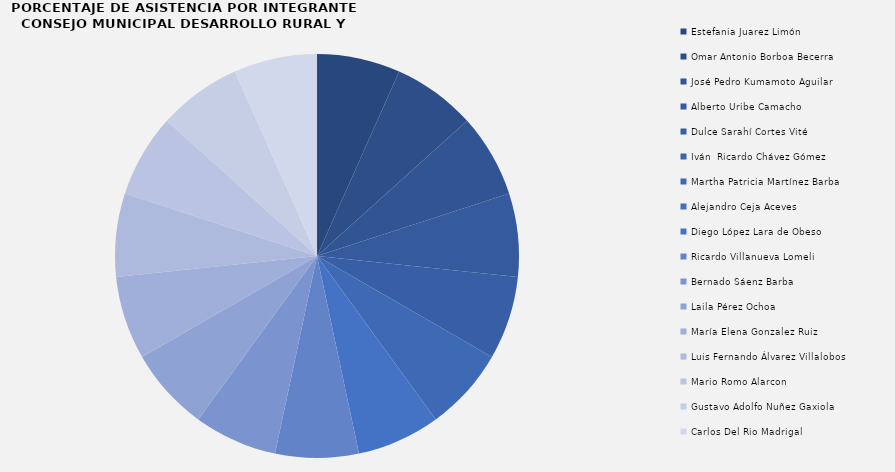
| Category | Series 0 |
|---|---|
| Estefania Juarez Limón | 1 |
| Omar Antonio Borboa Becerra | 1 |
| José Pedro Kumamoto Aguilar | 1 |
| Alberto Uribe Camacho | 1 |
| Dulce Sarahí Cortes Vité | 1 |
| Iván  Ricardo Chávez Gómez | 0 |
| Martha Patricia Martínez Barba | 1 |
| Alejandro Ceja Aceves | 0 |
| Diego López Lara de Obeso | 1 |
| Ricardo Villanueva Lomeli | 1 |
| Bernado Sáenz Barba | 1 |
| Laila Pérez Ochoa | 1 |
| María Elena Gonzalez Ruiz | 1 |
| Luis Fernando Álvarez Villalobos | 1 |
| Mario Romo Alarcon | 1 |
| Gustavo Adolfo Nuñez Gaxiola | 1 |
| Carlos Del Rio Madrigal | 1 |